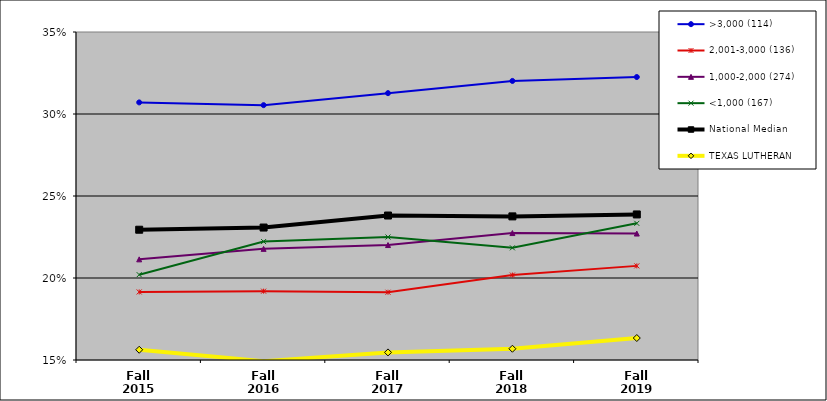
| Category | >3,000 (114) | 2,001-3,000 (136) | 1,000-2,000 (274) | <1,000 (167) | National Median | TEXAS LUTHERAN |
|---|---|---|---|---|---|---|
| Fall 2015 | 0.307 | 0.191 | 0.211 | 0.202 | 0.229 | 0.156 |
| Fall 2016 | 0.305 | 0.192 | 0.218 | 0.222 | 0.231 | 0.149 |
| Fall 2017 | 0.313 | 0.191 | 0.22 | 0.225 | 0.238 | 0.155 |
| Fall 2018 | 0.32 | 0.202 | 0.227 | 0.218 | 0.238 | 0.157 |
| Fall 2019 | 0.323 | 0.207 | 0.227 | 0.233 | 0.239 | 0.163 |